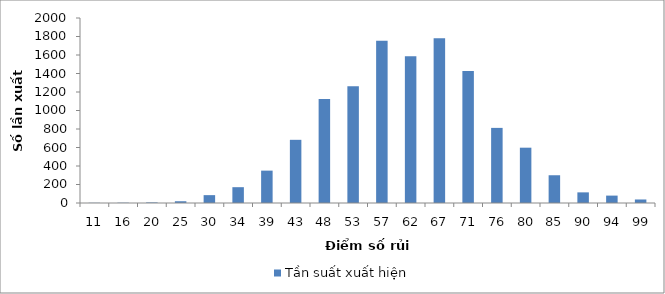
| Category | Tần suất xuất hiện |
|---|---|
| 11.0 | 2 |
| 15.631578947368421 | 3 |
| 20.263157894736842 | 6 |
| 24.894736842105264 | 19 |
| 29.526315789473685 | 85 |
| 34.15789473684211 | 171 |
| 38.789473684210535 | 350 |
| 43.42105263157896 | 683 |
| 48.052631578947384 | 1123 |
| 52.68421052631581 | 1262 |
| 57.315789473684234 | 1754 |
| 61.94736842105266 | 1586 |
| 66.57894736842108 | 1781 |
| 71.21052631578951 | 1427 |
| 75.84210526315793 | 812 |
| 80.47368421052636 | 598 |
| 85.10526315789478 | 300 |
| 89.73684210526321 | 115 |
| 94.36842105263163 | 80 |
| 99.00000000000006 | 38 |